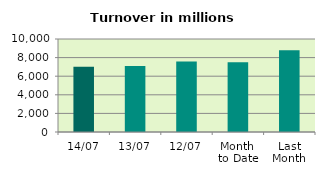
| Category | Series 0 |
|---|---|
| 14/07 | 7024.523 |
| 13/07 | 7103.28 |
| 12/07 | 7577.859 |
| Month 
to Date | 7490.601 |
| Last
Month | 8790.45 |